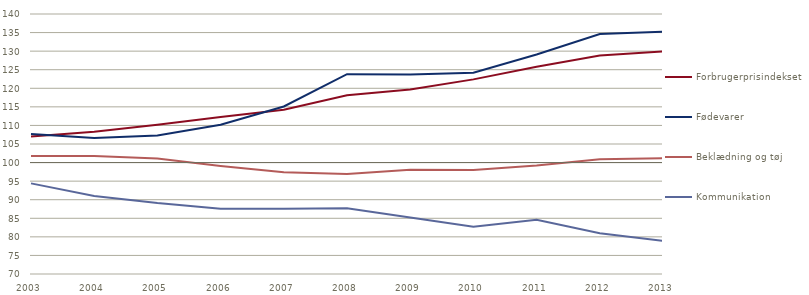
| Category | Forbrugerprisindekset | Fødevarer | Beklædning og tøj | Kommunikation |
|---|---|---|---|---|
| 2003.0 | 107 | 107.7 | 101.8 | 94.4 |
| 2004.0 | 108.3 | 106.6 | 101.8 | 91 |
| 2005.0 | 110.2 | 107.3 | 101.1 | 89.1 |
| 2006.0 | 112.3 | 110.2 | 99.1 | 87.6 |
| 2007.0 | 114.2 | 115.1 | 97.4 | 87.6 |
| 2008.0 | 118.1 | 123.8 | 96.9 | 87.7 |
| 2009.0 | 119.7 | 123.7 | 98.1 | 85.2 |
| 2010.0 | 122.4 | 124.2 | 98 | 82.7 |
| 2011.0 | 125.8 | 129.1 | 99.2 | 84.6 |
| 2012.0 | 128.8 | 134.6 | 100.9 | 81 |
| 2013.0 | 129.9 | 135.2 | 101.2 | 78.9 |